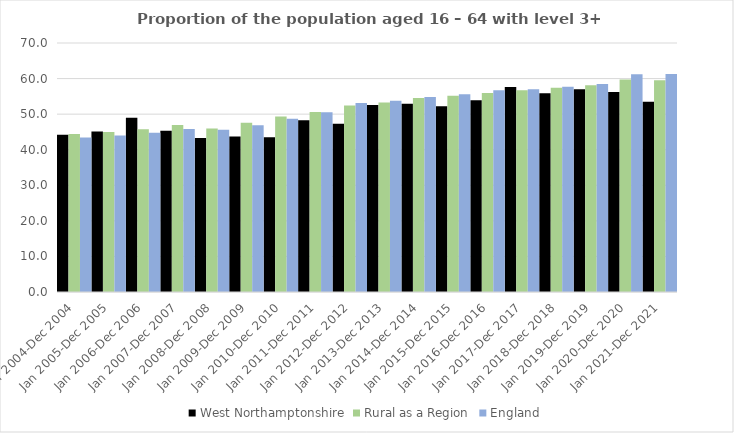
| Category | West Northamptonshire | Rural as a Region | England |
|---|---|---|---|
| Jan 2004-Dec 2004 | 44.2 | 44.405 | 43.4 |
| Jan 2005-Dec 2005 | 45.1 | 44.973 | 44 |
| Jan 2006-Dec 2006 | 49 | 45.774 | 44.8 |
| Jan 2007-Dec 2007 | 45.3 | 46.968 | 45.8 |
| Jan 2008-Dec 2008 | 43.3 | 45.964 | 45.6 |
| Jan 2009-Dec 2009 | 43.7 | 47.59 | 46.9 |
| Jan 2010-Dec 2010 | 43.5 | 49.362 | 48.7 |
| Jan 2011-Dec 2011 | 48.3 | 50.602 | 50.5 |
| Jan 2012-Dec 2012 | 47.3 | 52.439 | 53.1 |
| Jan 2013-Dec 2013 | 52.6 | 53.276 | 53.8 |
| Jan 2014-Dec 2014 | 52.9 | 54.57 | 54.8 |
| Jan 2015-Dec 2015 | 52.2 | 55.16 | 55.6 |
| Jan 2016-Dec 2016 | 53.9 | 55.941 | 56.7 |
| Jan 2017-Dec 2017 | 57.6 | 56.689 | 57 |
| Jan 2018-Dec 2018 | 55.9 | 57.389 | 57.7 |
| Jan 2019-Dec 2019 | 57 | 58.147 | 58.5 |
| Jan 2020-Dec 2020 | 56.2 | 59.771 | 61.2 |
| Jan 2021-Dec 2021 | 53.5 | 59.54 | 61.3 |